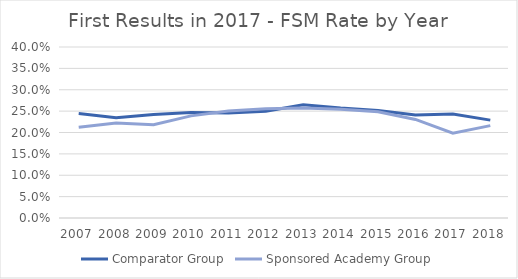
| Category | Comparator Group | Sponsored Academy Group |
|---|---|---|
| 2007.0 | 0.244 | 0.212 |
| 2008.0 | 0.235 | 0.222 |
| 2009.0 | 0.242 | 0.218 |
| 2010.0 | 0.247 | 0.239 |
| 2011.0 | 0.245 | 0.25 |
| 2012.0 | 0.25 | 0.255 |
| 2013.0 | 0.265 | 0.257 |
| 2014.0 | 0.257 | 0.255 |
| 2015.0 | 0.252 | 0.249 |
| 2016.0 | 0.241 | 0.23 |
| 2017.0 | 0.243 | 0.198 |
| 2018.0 | 0.229 | 0.216 |